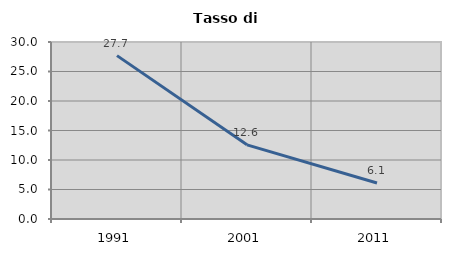
| Category | Tasso di disoccupazione   |
|---|---|
| 1991.0 | 27.689 |
| 2001.0 | 12.574 |
| 2011.0 | 6.105 |